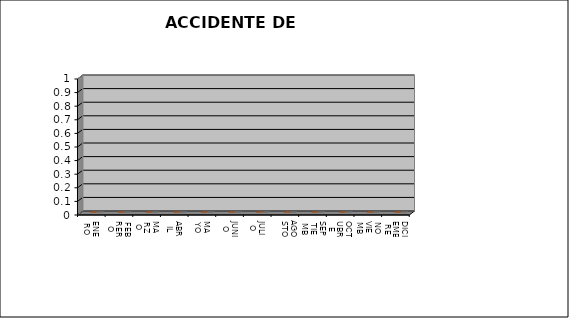
| Category | ACC. TRABAJO |
|---|---|
| ENERO | 0 |
| FEBRERO | 0 |
| MARZO | 0 |
| ABRIL | 0 |
| MAYO | 0 |
| JUNIO | 0 |
| JULIO | 0 |
| AGOSTO | 0 |
| SEPTIEMBRE | 0 |
| OCTUBRE | 0 |
| NOVIEMBRE | 0 |
| DICIEMBRE | 0 |